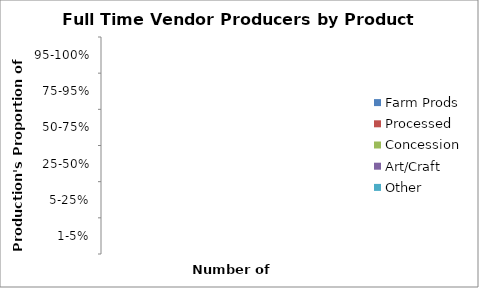
| Category | Farm Prods | Processed | Concession | Art/Craft | Other |
|---|---|---|---|---|---|
| 1-5% | 0 | 0 | 0 | 0 | 0 |
| 5-25% | 0 | 0 | 0 | 0 | 0 |
| 25-50% | 0 | 0 | 0 | 0 | 0 |
| 50-75% | 0 | 0 | 0 | 0 | 0 |
| 75-95% | 0 | 0 | 0 | 0 | 0 |
| 95-100% | 0 | 0 | 0 | 0 | 0 |